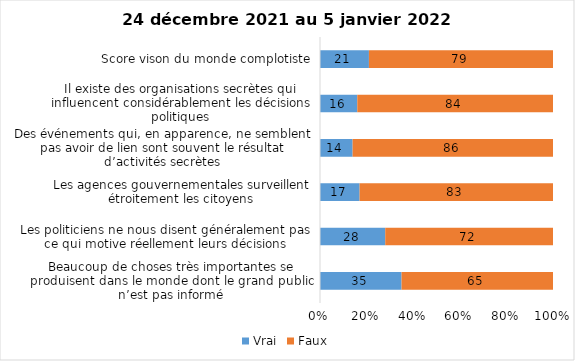
| Category | Vrai | Faux |
|---|---|---|
| Beaucoup de choses très importantes se produisent dans le monde dont le grand public n’est pas informé | 35 | 65 |
| Les politiciens ne nous disent généralement pas ce qui motive réellement leurs décisions | 28 | 72 |
| Les agences gouvernementales surveillent étroitement les citoyens | 17 | 83 |
| Des événements qui, en apparence, ne semblent pas avoir de lien sont souvent le résultat d’activités secrètes | 14 | 86 |
| Il existe des organisations secrètes qui influencent considérablement les décisions politiques | 16 | 84 |
| Score vison du monde complotiste | 21 | 79 |